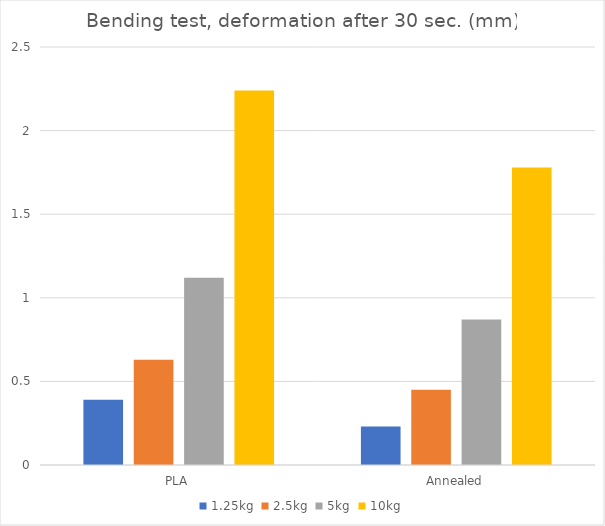
| Category | 1.25kg | 2.5kg | 5kg | 10kg |
|---|---|---|---|---|
| PLA | 0.39 | 0.63 | 1.12 | 2.24 |
| Annealed | 0.23 | 0.45 | 0.87 | 1.78 |